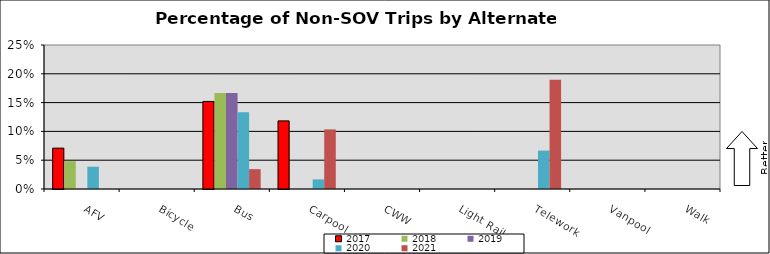
| Category | 2017 | 2018 | 2019 | 2020 | 2021 |
|---|---|---|---|---|---|
| AFV | 0.071 | 0.048 | 0 | 0.039 | 0 |
| Bicycle | 0 | 0 | 0 | 0 | 0 |
| Bus | 0.152 | 0.167 | 0.167 | 0.133 | 0.034 |
| Carpool | 0.118 | 0 | 0 | 0.017 | 0.103 |
| CWW | 0 | 0 | 0 | 0 | 0 |
| Light Rail | 0 | 0 | 0 | 0 | 0 |
| Telework | 0 | 0 | 0 | 0.067 | 0.19 |
| Vanpool | 0 | 0 | 0 | 0 | 0 |
| Walk | 0 | 0 | 0 | 0 | 0 |